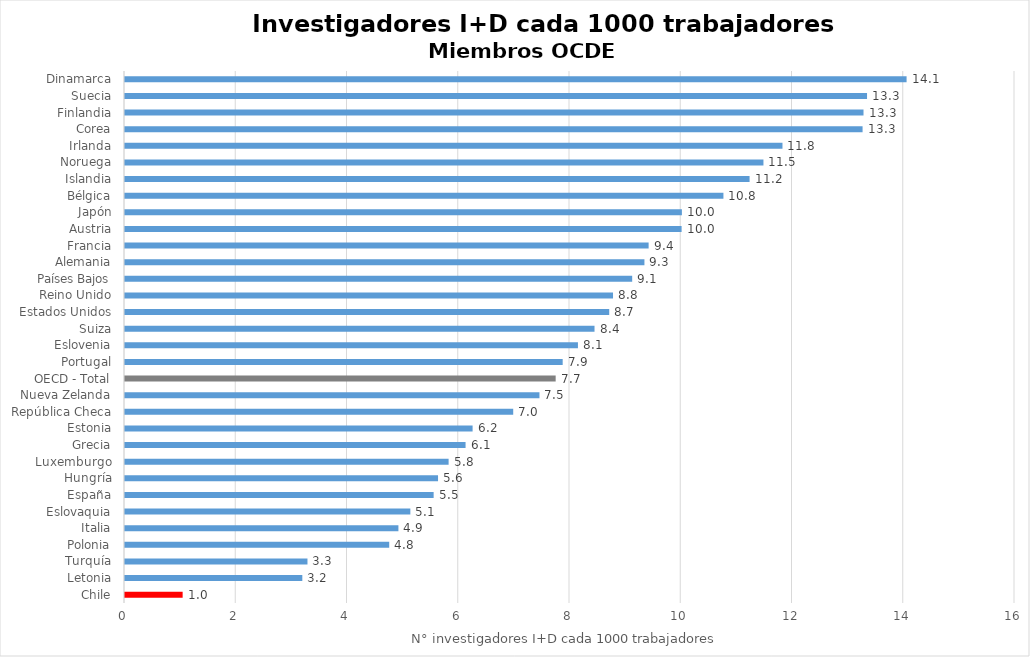
| Category | N° Investigadores I+D cada 1000 trabajadores |
|---|---|
| Chile | 1.036 |
| Letonia | 3.188 |
| Turquía | 3.28 |
| Polonia | 4.75 |
| Italia | 4.915 |
| Eslovaquia | 5.13 |
| España | 5.549 |
| Hungría | 5.628 |
| Luxemburgo | 5.818 |
| Grecia | 6.122 |
| Estonia | 6.249 |
| República Checa | 6.979 |
| Nueva Zelanda | 7.451 |
| OECD - Total | 7.742 |
| Portugal | 7.869 |
| Eslovenia | 8.143 |
| Suiza | 8.441 |
| Estados Unidos | 8.705 |
| Reino Unido | 8.773 |
| Países Bajos | 9.118 |
| Alemania | 9.338 |
| Francia | 9.413 |
| Austria | 10.006 |
| Japón | 10.012 |
| Bélgica | 10.758 |
| Islandia | 11.228 |
| Noruega | 11.478 |
| Irlanda | 11.82 |
| Corea | 13.26 |
| Finlandia | 13.277 |
| Suecia | 13.34 |
| Dinamarca | 14.051 |